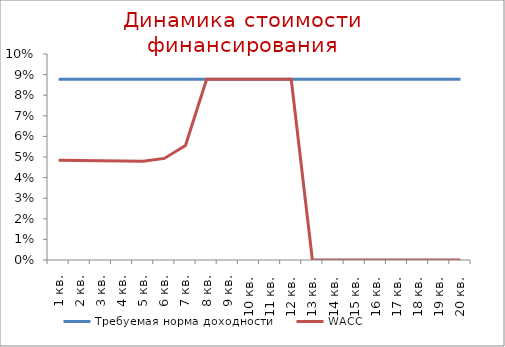
| Category | Требуемая норма доходности | WACC |
|---|---|---|
| 1 кв. | 0.088 | 0.048 |
| 2 кв. | 0.088 | 0.048 |
| 3 кв. | 0.088 | 0.048 |
| 4 кв. | 0.088 | 0.048 |
| 5 кв. | 0.088 | 0.048 |
| 6 кв. | 0.088 | 0.049 |
| 7 кв. | 0.088 | 0.056 |
| 8 кв. | 0.088 | 0.088 |
| 9 кв. | 0.088 | 0.088 |
| 10 кв. | 0.088 | 0.088 |
| 11 кв. | 0.088 | 0.088 |
| 12 кв. | 0.088 | 0.088 |
| 13 кв. | 0.088 | 0 |
| 14 кв. | 0.088 | 0 |
| 15 кв. | 0.088 | 0 |
| 16 кв. | 0.088 | 0 |
| 17 кв. | 0.088 | 0 |
| 18 кв. | 0.088 | 0 |
| 19 кв. | 0.088 | 0 |
| 20 кв. | 0.088 | 0 |